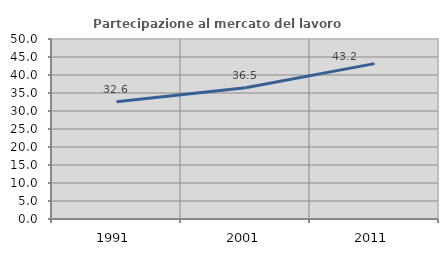
| Category | Partecipazione al mercato del lavoro  femminile |
|---|---|
| 1991.0 | 32.584 |
| 2001.0 | 36.48 |
| 2011.0 | 43.156 |